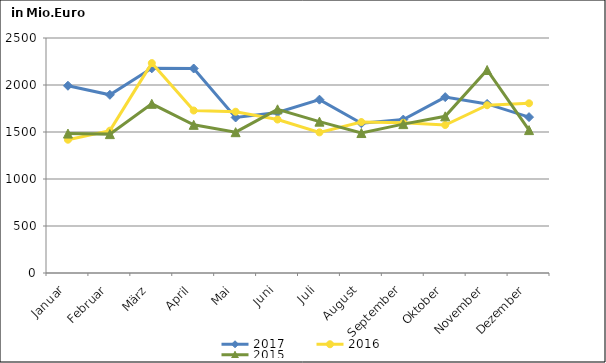
| Category | 2017 | 2016 | 2015 |
|---|---|---|---|
| Januar | 1991.964 | 1418.081 | 1483.329 |
| Februar | 1895.588 | 1514.211 | 1477.46 |
| März | 2177.247 | 2232.937 | 1800.029 |
| April | 2175.425 | 1728.624 | 1576.293 |
| Mai | 1654.637 | 1715.398 | 1498.124 |
| Juni | 1707.941 | 1632.803 | 1741.269 |
| Juli | 1844.042 | 1496.062 | 1610.203 |
| August | 1592.718 | 1605.52 | 1488.872 |
| September | 1632.185 | 1598.355 | 1583.92 |
| Oktober | 1870.85 | 1574.617 | 1666.689 |
| November | 1798.673 | 1784.503 | 2159.616 |
| Dezember | 1658.261 | 1805.169 | 1520.186 |